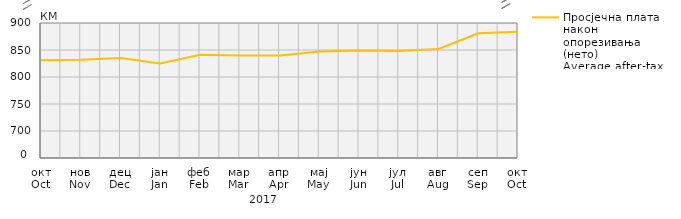
| Category | Просјечна плата након опорезивања (нето) 
Average after-tax (net) wage |
|---|---|
| окт
Oct | 831 |
| нов
Nov | 832 |
| дец
Dec | 835 |
| јан
Jan | 825 |
| феб
Feb | 841 |
| мар
Mar | 840 |
| апр
Apr | 840 |
| мај
May | 847 |
| јун
Jun | 849 |
| јул
Jul | 848 |
| авг
Aug | 852 |
| сеп
Sep | 881 |
| окт
Oct | 884 |